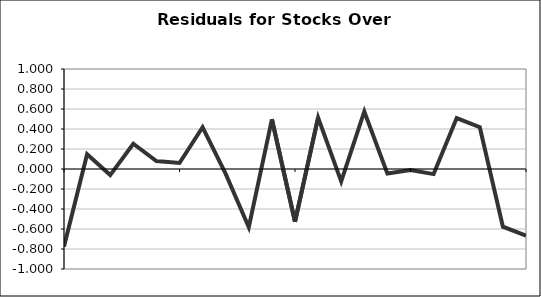
| Category | Series 0 |
|---|---|
| 0 | -0.775 |
| 1 | 0.147 |
| 2 | -0.061 |
| 3 | 0.252 |
| 4 | 0.08 |
| 5 | 0.06 |
| 6 | 0.417 |
| 7 | -0.049 |
| 8 | -0.582 |
| 9 | 0.497 |
| 10 | -0.527 |
| 11 | 0.513 |
| 12 | -0.124 |
| 13 | 0.575 |
| 14 | -0.046 |
| 15 | -0.011 |
| 16 | -0.051 |
| 17 | 0.51 |
| 18 | 0.417 |
| 19 | -0.577 |
| 20 | -0.666 |